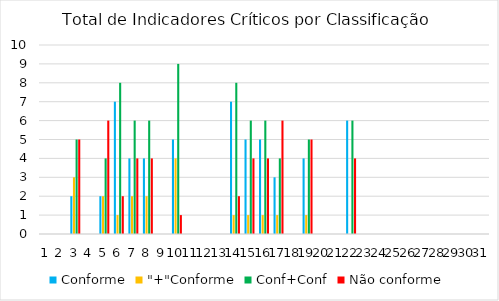
| Category | Conforme | "+"Conforme | Conf+Conf | Não conforme |
|---|---|---|---|---|
| 0 | 0 | 0 | 0 | 0 |
| 1 | 0 | 0 | 0 | 0 |
| 2 | 2 | 3 | 5 | 5 |
| 3 | 0 | 0 | 0 | 0 |
| 4 | 2 | 2 | 4 | 6 |
| 5 | 7 | 1 | 8 | 2 |
| 6 | 4 | 2 | 6 | 4 |
| 7 | 4 | 2 | 6 | 4 |
| 8 | 0 | 0 | 0 | 0 |
| 9 | 5 | 4 | 9 | 1 |
| 10 | 0 | 0 | 0 | 0 |
| 11 | 0 | 0 | 0 | 0 |
| 12 | 0 | 0 | 0 | 0 |
| 13 | 7 | 1 | 8 | 2 |
| 14 | 5 | 1 | 6 | 4 |
| 15 | 5 | 1 | 6 | 4 |
| 16 | 3 | 1 | 4 | 6 |
| 17 | 0 | 0 | 0 | 0 |
| 18 | 4 | 1 | 5 | 5 |
| 19 | 0 | 0 | 0 | 0 |
| 20 | 0 | 0 | 0 | 0 |
| 21 | 6 | 0 | 6 | 4 |
| 22 | 0 | 0 | 0 | 0 |
| 23 | 0 | 0 | 0 | 0 |
| 24 | 0 | 0 | 0 | 0 |
| 25 | 0 | 0 | 0 | 0 |
| 26 | 0 | 0 | 0 | 0 |
| 27 | 0 | 0 | 0 | 0 |
| 28 | 0 | 0 | 0 | 0 |
| 29 | 0 | 0 | 0 | 0 |
| 30 | 0 | 0 | 0 | 0 |